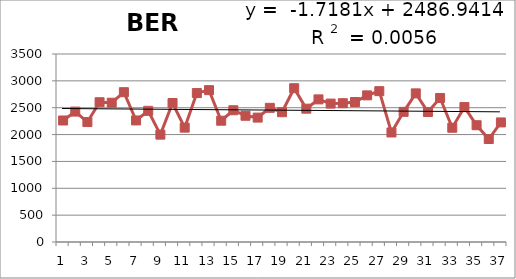
| Category | 1976-2012 |
|---|---|
| 0 | 2262 |
| 1 | 2428 |
| 2 | 2233 |
| 3 | 2602 |
| 4 | 2593 |
| 5 | 2789 |
| 6 | 2263 |
| 7 | 2442 |
| 8 | 1999 |
| 9 | 2587 |
| 10 | 2129 |
| 11 | 2773 |
| 12 | 2827 |
| 13 | 2258 |
| 14 | 2453 |
| 15 | 2350 |
| 16 | 2316 |
| 17 | 2498 |
| 18 | 2416 |
| 19 | 2863 |
| 20 | 2482 |
| 21 | 2655 |
| 22 | 2577 |
| 23 | 2584 |
| 24 | 2606 |
| 25 | 2730 |
| 26 | 2808 |
| 27 | 2039 |
| 28 | 2423 |
| 29 | 2767 |
| 30 | 2420 |
| 31 | 2681 |
| 32 | 2127 |
| 33 | 2512 |
| 34 | 2174 |
| 35 | 1917 |
| 36 | 2226 |